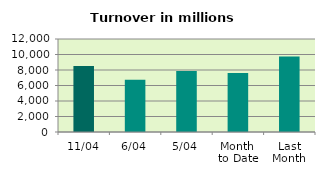
| Category | Series 0 |
|---|---|
| 11/04 | 8505.221 |
| 6/04 | 6742.797 |
| 5/04 | 7880.303 |
| Month 
to Date | 7608.645 |
| Last
Month | 9734.736 |